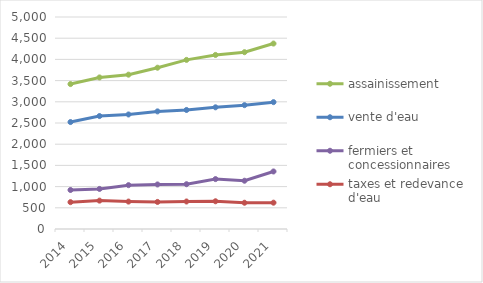
| Category | assainissement | vente d'eau | fermiers et concessionnaires | taxes et redevance d'eau |
|---|---|---|---|---|
| 2014.0 | 3418.134 | 2522.382 | 919.937 | 633.298 |
| 2015.0 | 3574.509 | 2663.986 | 945.162 | 669.329 |
| 2016.0 | 3640.117 | 2701.292 | 1034.235 | 646.774 |
| 2017.0 | 3804.069 | 2773.868 | 1050.665 | 638.289 |
| 2018.0 | 3988.379 | 2807.582 | 1056.345 | 648.666 |
| 2019.0 | 4105.312 | 2870.113 | 1177.276 | 654.009 |
| 2020.0 | 4169.867 | 2921.003 | 1138.454 | 619.356 |
| 2021.0 | 4373.686 | 2992.1 | 1356.962 | 620.682 |